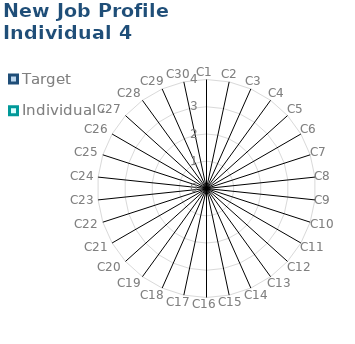
| Category | Target | Individual 4 |
|---|---|---|
| C1 | 0 | 0 |
| C2 | 0 | 0 |
| C3 | 0 | 0 |
| C4 | 0 | 0 |
| C5 | 0 | 0 |
| C6 | 0 | 0 |
| C7 | 0 | 0 |
| C8 | 0 | 0 |
| C9 | 0 | 0 |
| C10 | 0 | 0 |
| C11 | 0 | 0 |
| C12 | 0 | 0 |
| C13 | 0 | 0 |
| C14 | 0 | 0 |
| C15 | 0 | 0 |
| C16 | 0 | 0 |
| C17 | 0 | 0 |
| C18 | 0 | 0 |
| C19 | 0 | 0 |
| C20 | 0 | 0 |
| C21 | 0 | 0 |
| C22 | 0 | 0 |
| C23 | 0 | 0 |
| C24 | 0 | 0 |
| C25 | 0 | 0 |
| C26 | 0 | 0 |
| C27 | 0 | 0 |
| C28 | 0 | 0 |
| C29 | 0 | 0 |
| C30 | 0 | 0 |